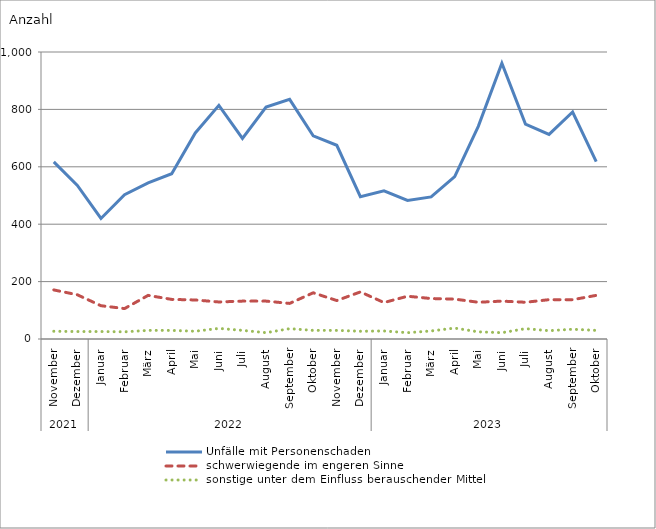
| Category | Unfälle mit Personenschaden | schwerwiegende im engeren Sinne | sonstige unter dem Einfluss berauschender Mittel |
|---|---|---|---|
| 0 | 617 | 171 | 27 |
| 1 | 535 | 154 | 26 |
| 2 | 420 | 116 | 26 |
| 3 | 503 | 106 | 25 |
| 4 | 544 | 152 | 30 |
| 5 | 576 | 138 | 30 |
| 6 | 718 | 136 | 27 |
| 7 | 814 | 129 | 37 |
| 8 | 699 | 132 | 30 |
| 9 | 808 | 132 | 22 |
| 10 | 835 | 124 | 36 |
| 11 | 708 | 161 | 30 |
| 12 | 675 | 134 | 30 |
| 13 | 496 | 164 | 27 |
| 14 | 516 | 127 | 28 |
| 15 | 483 | 149 | 22 |
| 16 | 495 | 141 | 28 |
| 17 | 566 | 139 | 38 |
| 18 | 741 | 128 | 25 |
| 19 | 961 | 132 | 22 |
| 20 | 749 | 128 | 36 |
| 21 | 713 | 137 | 29 |
| 22 | 791 | 137 | 34 |
| 23 | 618 | 152 | 30 |